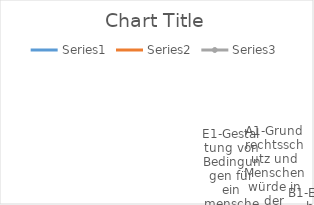
| Category | Series 0 | Series 1 | Series 2 |
|---|---|---|---|
| A1-Grundrechtsschutz und Menschenwürde in der Lieferkette | 0 | 0 | 10 |
| B1-Ethisches Finanzgebaren / Geld und Mensch | 0 | 0 | 10 |
| C1-Individuelle Rechts- und Gleichstellung | 0 | 0 | 10 |
| D1-Schutz des Individuums, Rechtsgleichheit | 0 | 0 | 10 |
| E1-Gestaltung von Bedingungen für ein menschenwürdiges Leben, zukünftige Generationen | 0 | 0 | 10 |